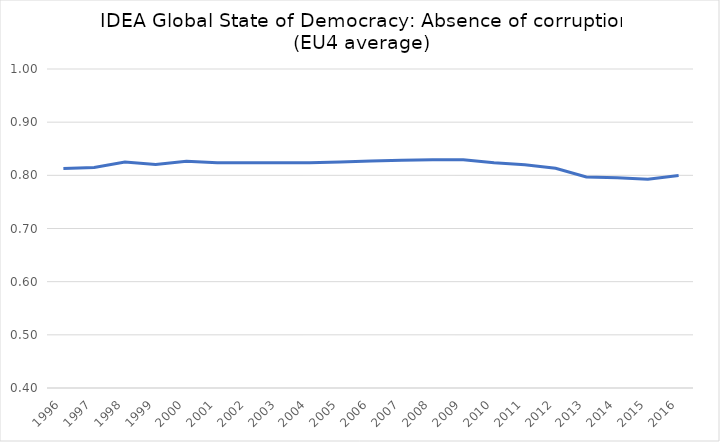
| Category | Avg |
|---|---|
| 1996.0 | 0.813 |
| 1997.0 | 0.815 |
| 1998.0 | 0.825 |
| 1999.0 | 0.82 |
| 2000.0 | 0.827 |
| 2001.0 | 0.824 |
| 2002.0 | 0.824 |
| 2003.0 | 0.824 |
| 2004.0 | 0.824 |
| 2005.0 | 0.825 |
| 2006.0 | 0.827 |
| 2007.0 | 0.828 |
| 2008.0 | 0.829 |
| 2009.0 | 0.829 |
| 2010.0 | 0.824 |
| 2011.0 | 0.82 |
| 2012.0 | 0.813 |
| 2013.0 | 0.797 |
| 2014.0 | 0.796 |
| 2015.0 | 0.793 |
| 2016.0 | 0.8 |